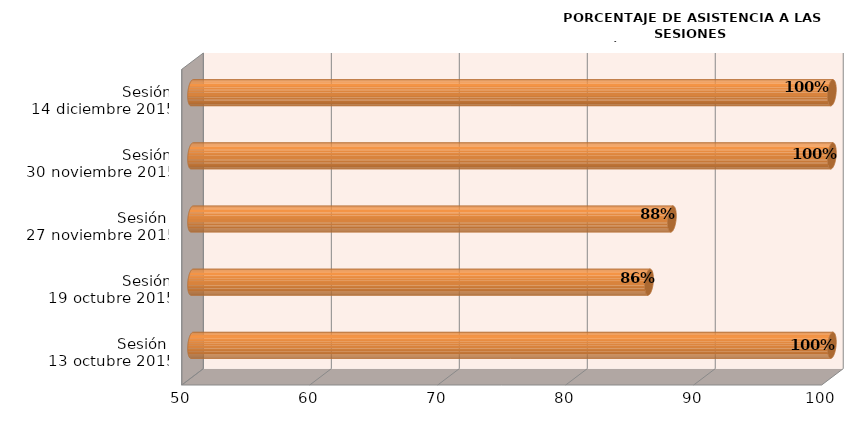
| Category | Series 0 |
|---|---|
| Sesión 
13 octubre 2015 | 100 |
| Sesión
19 octubre 2015 | 85.714 |
| Sesión 
27 noviembre 2015 | 87.5 |
| Sesión
30 noviembre 2015 | 100 |
| Sesión
14 diciembre 2015 | 100 |